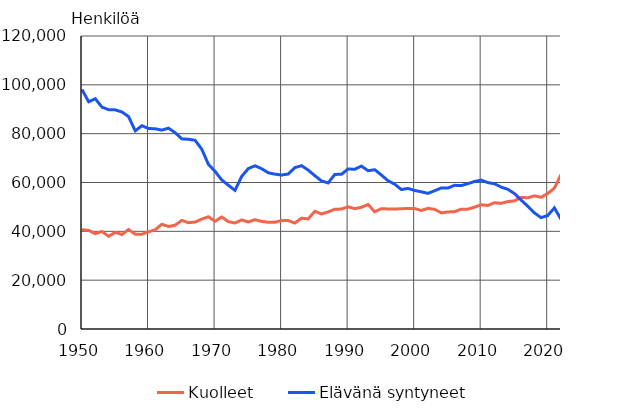
| Category | Kuolleet | Elävänä syntyneet |
|---|---|---|
| 1950 | 40681 | 98065 |
| 1951 | 40386 | 93063 |
| 1952 | 39024 | 94314 |
| 1953 | 39925 | 90866 |
| 1954 | 37988 | 89845 |
| 1955 | 39573 | 89740 |
| 1956 | 38713 | 88896 |
| 1957 | 40741 | 86985 |
| 1958 | 38833 | 81148 |
| 1959 | 38827 | 83253 |
| 1960 | 39797 | 82129 |
| 1961 | 40616 | 81996 |
| 1962 | 42889 | 81454 |
| 1963 | 42010 | 82251 |
| 1964 | 42512 | 80428 |
| 1965 | 44473 | 77885 |
| 1966 | 43548 | 77697 |
| 1967 | 43790 | 77289 |
| 1968 | 45013 | 73654 |
| 1969 | 45966 | 67450 |
| 1970 | 44119 | 64559 |
| 1971 | 45876 | 61067 |
| 1972 | 43958 | 58864 |
| 1973 | 43410 | 56787 |
| 1974 | 44676 | 62472 |
| 1975 | 43828 | 65719 |
| 1976 | 44786 | 66846 |
| 1977 | 44065 | 65659 |
| 1978 | 43692 | 63983 |
| 1979 | 43738 | 63428 |
| 1980 | 44398 | 63064 |
| 1981 | 44404 | 63469 |
| 1982 | 43408 | 66106 |
| 1983 | 45388 | 66892 |
| 1984 | 45098 | 65076 |
| 1985 | 48198 | 62796 |
| 1986 | 47135 | 60632 |
| 1987 | 47949 | 59827 |
| 1988 | 49063 | 63316 |
| 1989 | 49110 | 63348 |
| 1990 | 50058 | 65549 |
| 1991 | 49294 | 65395 |
| 1992 | 49844 | 66731 |
| 1993 | 50988 | 64826 |
| 1994 | 48000 | 65231 |
| 1995 | 49280 | 63067 |
| 1996 | 49167 | 60723 |
| 1997 | 49108 | 59329 |
| 1998 | 49262 | 57108 |
| 1999 | 49345 | 57574 |
| 2000 | 49339 | 56742 |
| 2001 | 48550 | 56189 |
| 2002 | 49418 | 55555 |
| 2003 | 48996 | 56630 |
| 2004 | 47600 | 57758 |
| 2005 | 47928 | 57745 |
| 2006 | 48065 | 58840 |
| 2007 | 49077 | 58729 |
| 2008 | 49094 | 59530 |
| 2009 | 49883 | 60430 |
| 2010 | 50887 | 60980 |
| 2011 | 50585 | 59961 |
| 2012 | 51707 | 59493 |
| 2013 | 51472 | 58134 |
| 2014 | 52186 | 57232 |
| 2015 | 52492 | 55472 |
| 2016 | 53923 | 52814 |
| 2017 | 53722 | 50321 |
| 2018 | 54527 | 47577 |
| 2019 | 53949 | 45613 |
| 2020 | 55488 | 46463 |
| 2021 | 57659 | 49594 |
| 2022 | 63219 | 44951 |